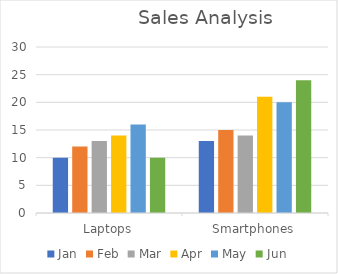
| Category | Jan | Feb | Mar | Apr | May | Jun |
|---|---|---|---|---|---|---|
| Laptops | 10 | 12 | 13 | 14 | 16 | 10 |
| Smartphones | 13 | 15 | 14 | 21 | 20 | 24 |